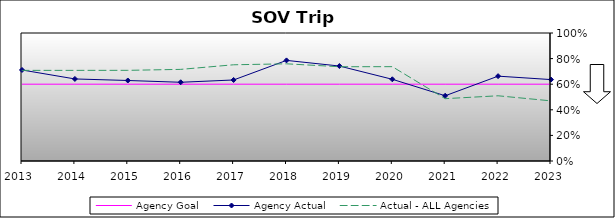
| Category | Agency Goal | Agency Actual | Actual - ALL Agencies |
|---|---|---|---|
| 2013.0 | 0.6 | 0.711 | 0.708 |
| 2014.0 | 0.6 | 0.641 | 0.708 |
| 2015.0 | 0.6 | 0.629 | 0.708 |
| 2016.0 | 0.6 | 0.615 | 0.716 |
| 2017.0 | 0.6 | 0.633 | 0.752 |
| 2018.0 | 0.6 | 0.786 | 0.759 |
| 2019.0 | 0.6 | 0.742 | 0.736 |
| 2020.0 | 0.6 | 0.638 | 0.737 |
| 2021.0 | 0.6 | 0.51 | 0.487 |
| 2022.0 | 0.6 | 0.663 | 0.509 |
| 2023.0 | 0.6 | 0.636 | 0.47 |